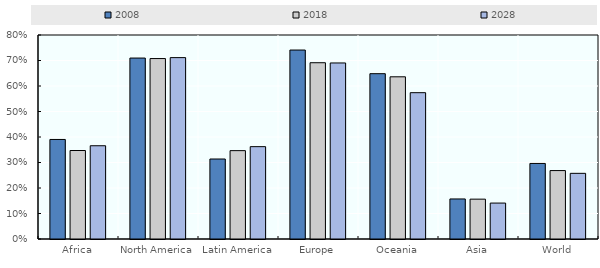
| Category | 2008 | 2018 | 2028 |
|---|---|---|---|
| Africa | 0.39 | 0.347 | 0.366 |
| North America | 0.71 | 0.708 | 0.711 |
| Latin America | 0.314 | 0.347 | 0.362 |
| Europe | 0.741 | 0.691 | 0.69 |
| Oceania | 0.648 | 0.636 | 0.574 |
| Asia | 0.157 | 0.156 | 0.141 |
| World | 0.296 | 0.268 | 0.257 |